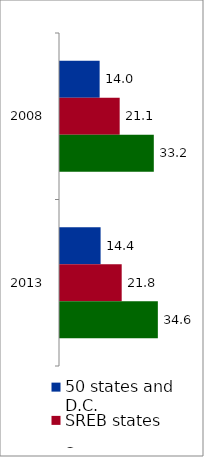
| Category | 50 states and D.C. | SREB states | State |
|---|---|---|---|
| 2008 | 14.03 | 21.125 | 33.205 |
| 2013 | 14.372 | 21.839 | 34.635 |